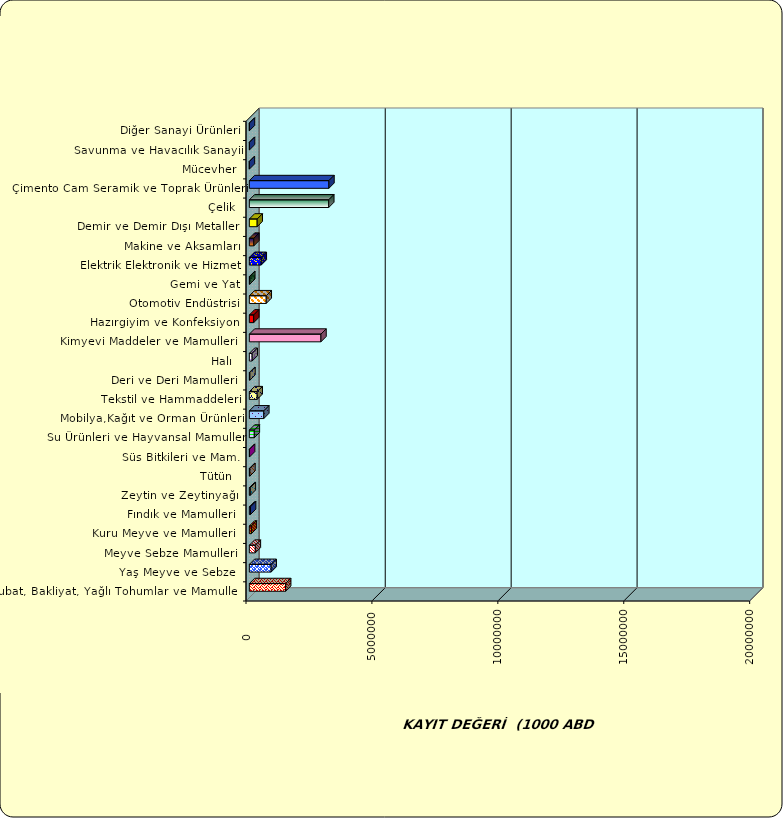
| Category | Series 0 |
|---|---|
|  Hububat, Bakliyat, Yağlı Tohumlar ve Mamulleri  | 1440790.243 |
|  Yaş Meyve ve Sebze   | 865645.045 |
|  Meyve Sebze Mamulleri  | 236774.995 |
|  Kuru Meyve ve Mamulleri   | 78136.727 |
|  Fındık ve Mamulleri  | 46421.538 |
|  Zeytin ve Zeytinyağı  | 37167.395 |
|  Tütün  | 21531.114 |
|  Süs Bitkileri ve Mam. | 8185.327 |
|  Su Ürünleri ve Hayvansal Mamuller | 196475.927 |
|  Mobilya,Kağıt ve Orman Ürünleri | 573706.4 |
|  Tekstil ve Hammaddeleri | 310944.802 |
|  Deri ve Deri Mamulleri  | 22690.783 |
|  Halı  | 111789.757 |
|  Kimyevi Maddeler ve Mamulleri   | 2843001.74 |
|  Hazırgiyim ve Konfeksiyon  | 173525.523 |
|  Otomotiv Endüstrisi | 669844.875 |
|  Gemi ve Yat | 15263.348 |
|  Elektrik Elektronik ve Hizmet | 471905.118 |
|  Makine ve Aksamları | 178235.42 |
|  Demir ve Demir Dışı Metaller  | 311204.667 |
|  Çelik | 3152602.32 |
|  Çimento Cam Seramik ve Toprak Ürünleri | 3159260.168 |
|  Mücevher | 709.258 |
|  Savunma ve Havacılık Sanayii | 5299.501 |
|  Diğer Sanayi Ürünleri | 2280.988 |